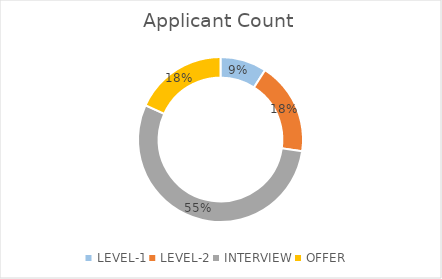
| Category | Series 0 |
|---|---|
| LEVEL-1 | 1 |
| LEVEL-2 | 2 |
| INTERVIEW | 6 |
| OFFER | 2 |